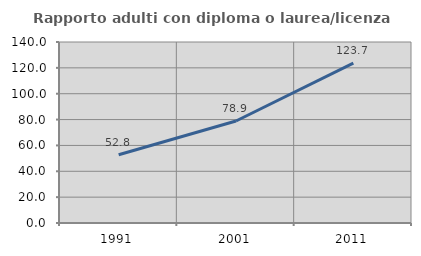
| Category | Rapporto adulti con diploma o laurea/licenza media  |
|---|---|
| 1991.0 | 52.815 |
| 2001.0 | 78.899 |
| 2011.0 | 123.678 |